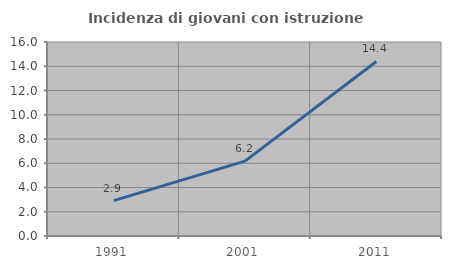
| Category | Incidenza di giovani con istruzione universitaria |
|---|---|
| 1991.0 | 2.914 |
| 2001.0 | 6.179 |
| 2011.0 | 14.395 |